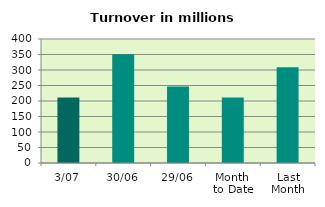
| Category | Series 0 |
|---|---|
| 3/07 | 211.073 |
| 30/06 | 351.101 |
| 29/06 | 246.441 |
| Month 
to Date | 211.073 |
| Last
Month | 308.534 |